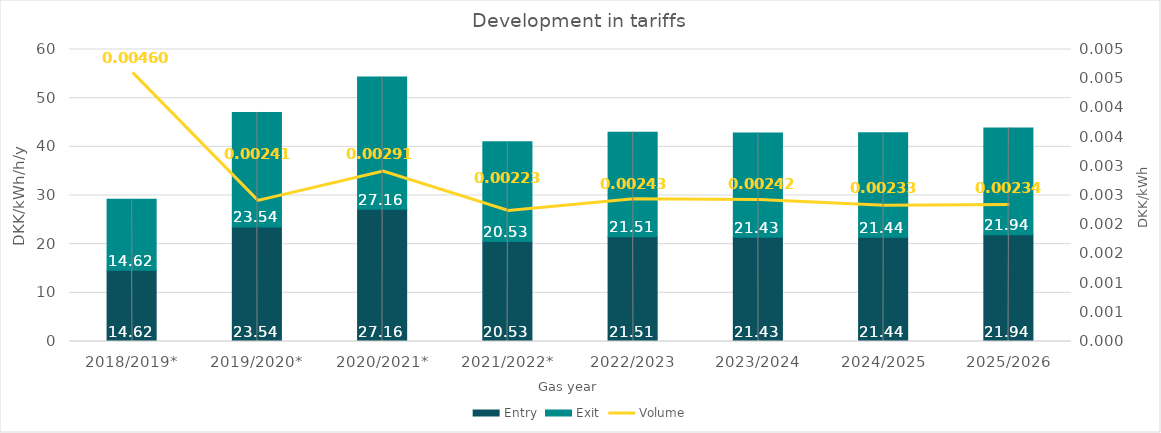
| Category | Entry | Exit |
|---|---|---|
| 2018/2019* | 14.62 | 14.62 |
| 2019/2020* | 23.54 | 23.54 |
| 2020/2021* | 27.162 | 27.162 |
| 2021/2022* | 20.526 | 20.526 |
| 2022/2023 | 21.508 | 21.508 |
| 2023/2024 | 21.432 | 21.432 |
| 2024/2025 | 21.441 | 21.441 |
| 2025/2026 | 21.937 | 21.937 |